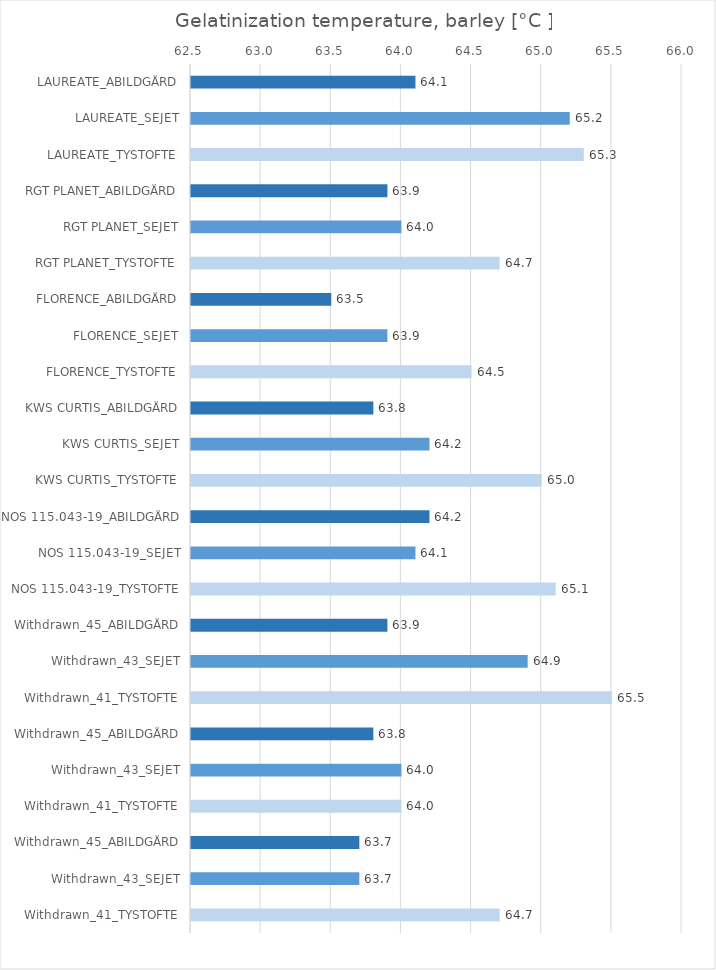
| Category |   Gelatinization temperature, barley [°C ] |
|---|---|
| LAUREATE_ABILDGÅRD | 64.1 |
| LAUREATE_SEJET | 65.2 |
| LAUREATE_TYSTOFTE | 65.3 |
| RGT PLANET_ABILDGÅRD | 63.9 |
| RGT PLANET_SEJET | 64 |
| RGT PLANET_TYSTOFTE | 64.7 |
| FLORENCE_ABILDGÅRD | 63.5 |
| FLORENCE_SEJET | 63.9 |
| FLORENCE_TYSTOFTE | 64.5 |
| KWS CURTIS_ABILDGÅRD | 63.8 |
| KWS CURTIS_SEJET | 64.2 |
| KWS CURTIS_TYSTOFTE | 65 |
| NOS 115.043-19_ABILDGÅRD | 64.2 |
| NOS 115.043-19_SEJET | 64.1 |
| NOS 115.043-19_TYSTOFTE | 65.1 |
| Withdrawn_45_ABILDGÅRD | 63.9 |
| Withdrawn_43_SEJET | 64.9 |
| Withdrawn_41_TYSTOFTE | 65.5 |
| Withdrawn_45_ABILDGÅRD | 63.8 |
| Withdrawn_43_SEJET | 64 |
| Withdrawn_41_TYSTOFTE | 64 |
| Withdrawn_45_ABILDGÅRD | 63.7 |
| Withdrawn_43_SEJET | 63.7 |
| Withdrawn_41_TYSTOFTE | 64.7 |